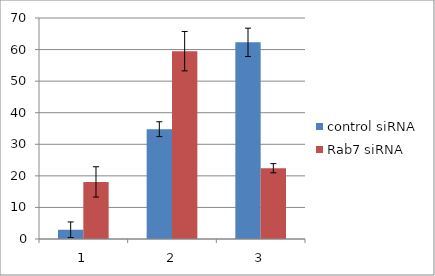
| Category | control siRNA | Rab7 siRNA |
|---|---|---|
| 0 | 2.93 | 18.086 |
| 1 | 34.784 | 59.494 |
| 2 | 62.286 | 22.421 |